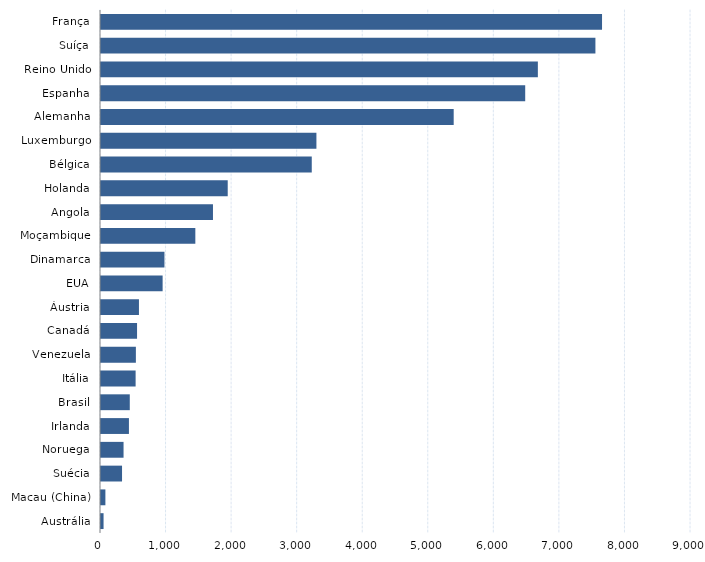
| Category | Series 0 |
|---|---|
| Austrália | 39 |
| Macau (China) | 67 |
| Suécia | 321 |
| Noruega | 344 |
| Irlanda | 426 |
| Brasil | 439 |
| Itália | 528 |
| Venezuela | 532 |
| Canadá | 550 |
| Áustria | 579 |
| EUA | 940 |
| Dinamarca | 968 |
| Moçambique | 1439 |
| Angola | 1708 |
| Holanda | 1933 |
| Bélgica | 3215 |
| Luxemburgo | 3286 |
| Alemanha | 5380 |
| Espanha | 6471 |
| Reino Unido | 6664 |
| Suíça | 7542 |
| França | 7643 |